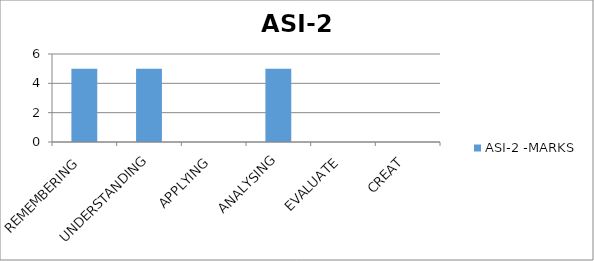
| Category | ASI-2 -MARKS |
|---|---|
| REMEMBERING | 5 |
| UNDERSTANDING | 5 |
| APPLYING | 0 |
| ANALYSING | 5 |
| EVALUATE | 0 |
| CREAT | 0 |